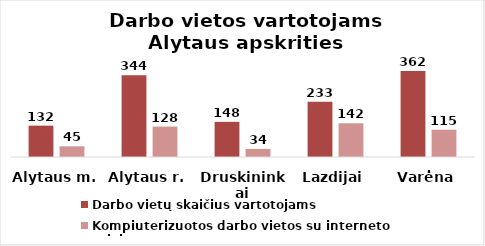
| Category | Darbo vietų skaičius vartotojams | Kompiuterizuotos darbo vietos su interneto prieiga |
|---|---|---|
| Alytaus m. | 132 | 45 |
| Alytaus r. | 344 | 128 |
| Druskininkai | 148 | 34 |
| Lazdijai | 233 | 142 |
| Varėna | 362 | 115 |